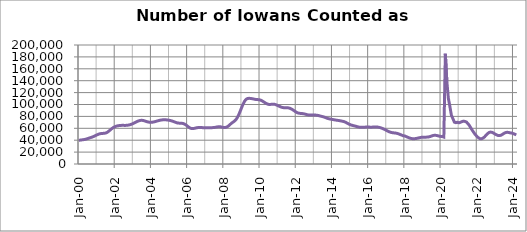
| Category | Series 0 |
|---|---|
| 2000-01-01 | 39830 |
| 2000-02-01 | 40147 |
| 2000-03-01 | 40514 |
| 2000-04-01 | 40882 |
| 2000-05-01 | 41314 |
| 2000-06-01 | 41949 |
| 2000-07-01 | 42786 |
| 2000-08-01 | 43704 |
| 2000-09-01 | 44538 |
| 2000-10-01 | 45369 |
| 2000-11-01 | 46421 |
| 2000-12-01 | 47638 |
| 2001-01-01 | 48876 |
| 2001-02-01 | 50011 |
| 2001-03-01 | 50833 |
| 2001-04-01 | 51273 |
| 2001-05-01 | 51437 |
| 2001-06-01 | 51614 |
| 2001-07-01 | 52204 |
| 2001-08-01 | 53465 |
| 2001-09-01 | 55340 |
| 2001-10-01 | 57507 |
| 2001-11-01 | 59630 |
| 2001-12-01 | 61447 |
| 2002-01-01 | 62791 |
| 2002-02-01 | 63691 |
| 2002-03-01 | 64287 |
| 2002-04-01 | 64669 |
| 2002-05-01 | 64891 |
| 2002-06-01 | 64965 |
| 2002-07-01 | 64915 |
| 2002-08-01 | 64891 |
| 2002-09-01 | 65052 |
| 2002-10-01 | 65429 |
| 2002-11-01 | 66023 |
| 2002-12-01 | 66863 |
| 2003-01-01 | 67993 |
| 2003-02-01 | 69300 |
| 2003-03-01 | 70620 |
| 2003-04-01 | 71806 |
| 2003-05-01 | 72744 |
| 2003-06-01 | 73309 |
| 2003-07-01 | 73369 |
| 2003-08-01 | 72946 |
| 2003-09-01 | 72139 |
| 2003-10-01 | 71272 |
| 2003-11-01 | 70583 |
| 2003-12-01 | 70165 |
| 2004-01-01 | 70093 |
| 2004-02-01 | 70340 |
| 2004-03-01 | 70866 |
| 2004-04-01 | 71551 |
| 2004-05-01 | 72278 |
| 2004-06-01 | 72994 |
| 2004-07-01 | 73630 |
| 2004-08-01 | 74060 |
| 2004-09-01 | 74268 |
| 2004-10-01 | 74325 |
| 2004-11-01 | 74177 |
| 2004-12-01 | 73909 |
| 2005-01-01 | 73474 |
| 2005-02-01 | 72885 |
| 2005-03-01 | 72129 |
| 2005-04-01 | 71211 |
| 2005-05-01 | 70200 |
| 2005-06-01 | 69259 |
| 2005-07-01 | 68744 |
| 2005-08-01 | 68630 |
| 2005-09-01 | 68578 |
| 2005-10-01 | 68176 |
| 2005-11-01 | 67243 |
| 2005-12-01 | 65744 |
| 2006-01-01 | 63789 |
| 2006-02-01 | 61778 |
| 2006-03-01 | 60216 |
| 2006-04-01 | 59491 |
| 2006-05-01 | 59563 |
| 2006-06-01 | 60147 |
| 2006-07-01 | 60766 |
| 2006-08-01 | 61189 |
| 2006-09-01 | 61436 |
| 2006-10-01 | 61375 |
| 2006-11-01 | 61120 |
| 2006-12-01 | 60856 |
| 2007-01-01 | 60796 |
| 2007-02-01 | 60930 |
| 2007-03-01 | 61043 |
| 2007-04-01 | 61052 |
| 2007-05-01 | 61070 |
| 2007-06-01 | 61166 |
| 2007-07-01 | 61441 |
| 2007-08-01 | 61931 |
| 2007-09-01 | 62403 |
| 2007-10-01 | 62627 |
| 2007-11-01 | 62449 |
| 2007-12-01 | 61907 |
| 2008-01-01 | 61354 |
| 2008-02-01 | 61225 |
| 2008-03-01 | 61926 |
| 2008-04-01 | 63517 |
| 2008-05-01 | 65680 |
| 2008-06-01 | 67978 |
| 2008-07-01 | 69953 |
| 2008-08-01 | 71714 |
| 2008-09-01 | 73963 |
| 2008-10-01 | 77479 |
| 2008-11-01 | 82475 |
| 2008-12-01 | 88556 |
| 2009-01-01 | 95033 |
| 2009-02-01 | 101068 |
| 2009-03-01 | 105865 |
| 2009-04-01 | 108847 |
| 2009-05-01 | 110152 |
| 2009-06-01 | 110374 |
| 2009-07-01 | 110130 |
| 2009-08-01 | 109719 |
| 2009-09-01 | 109178 |
| 2009-10-01 | 108654 |
| 2009-11-01 | 108303 |
| 2009-12-01 | 108148 |
| 2010-01-01 | 107766 |
| 2010-02-01 | 106830 |
| 2010-03-01 | 105361 |
| 2010-04-01 | 103721 |
| 2010-05-01 | 102142 |
| 2010-06-01 | 100842 |
| 2010-07-01 | 100168 |
| 2010-08-01 | 100123 |
| 2010-09-01 | 100423 |
| 2010-10-01 | 100573 |
| 2010-11-01 | 100225 |
| 2010-12-01 | 99308 |
| 2011-01-01 | 98136 |
| 2011-02-01 | 96946 |
| 2011-03-01 | 95833 |
| 2011-04-01 | 95011 |
| 2011-05-01 | 94638 |
| 2011-06-01 | 94578 |
| 2011-07-01 | 94559 |
| 2011-08-01 | 94300 |
| 2011-09-01 | 93606 |
| 2011-10-01 | 92454 |
| 2011-11-01 | 90901 |
| 2011-12-01 | 89145 |
| 2012-01-01 | 87414 |
| 2012-02-01 | 86047 |
| 2012-03-01 | 85325 |
| 2012-04-01 | 85003 |
| 2012-05-01 | 84785 |
| 2012-06-01 | 84470 |
| 2012-07-01 | 83856 |
| 2012-08-01 | 83126 |
| 2012-09-01 | 82596 |
| 2012-10-01 | 82254 |
| 2012-11-01 | 82147 |
| 2012-12-01 | 82190 |
| 2013-01-01 | 82261 |
| 2013-02-01 | 82221 |
| 2013-03-01 | 81902 |
| 2013-04-01 | 81347 |
| 2013-05-01 | 80684 |
| 2013-06-01 | 80023 |
| 2013-07-01 | 79385 |
| 2013-08-01 | 78573 |
| 2013-09-01 | 77510 |
| 2013-10-01 | 76572 |
| 2013-11-01 | 75894 |
| 2013-12-01 | 75406 |
| 2014-01-01 | 74970 |
| 2014-02-01 | 74463 |
| 2014-03-01 | 73979 |
| 2014-04-01 | 73583 |
| 2014-05-01 | 73194 |
| 2014-06-01 | 72759 |
| 2014-07-01 | 72272 |
| 2014-08-01 | 71753 |
| 2014-09-01 | 71064 |
| 2014-10-01 | 69998 |
| 2014-11-01 | 68577 |
| 2014-12-01 | 67159 |
| 2015-01-01 | 65998 |
| 2015-02-01 | 65189 |
| 2015-03-01 | 64544 |
| 2015-04-01 | 63879 |
| 2015-05-01 | 63156 |
| 2015-06-01 | 62438 |
| 2015-07-01 | 61892 |
| 2015-08-01 | 61594 |
| 2015-09-01 | 61550 |
| 2015-10-01 | 61718 |
| 2015-11-01 | 61985 |
| 2015-12-01 | 62133 |
| 2016-01-01 | 62078 |
| 2016-02-01 | 61964 |
| 2016-03-01 | 61917 |
| 2016-04-01 | 62010 |
| 2016-05-01 | 62206 |
| 2016-06-01 | 62320 |
| 2016-07-01 | 62132 |
| 2016-08-01 | 61632 |
| 2016-09-01 | 60956 |
| 2016-10-01 | 60079 |
| 2016-11-01 | 59003 |
| 2016-12-01 | 57827 |
| 2017-01-01 | 56329 |
| 2017-02-01 | 55037 |
| 2017-03-01 | 53922 |
| 2017-04-01 | 53130 |
| 2017-05-01 | 52606 |
| 2017-06-01 | 52266 |
| 2017-07-01 | 51976 |
| 2017-08-01 | 51468 |
| 2017-09-01 | 50674 |
| 2017-10-01 | 49676 |
| 2017-11-01 | 48612 |
| 2017-12-01 | 47468 |
| 2018-01-01 | 47198 |
| 2018-02-01 | 46122 |
| 2018-03-01 | 45041 |
| 2018-04-01 | 43974 |
| 2018-05-01 | 43141 |
| 2018-06-01 | 42643 |
| 2018-07-01 | 42452 |
| 2018-08-01 | 42657 |
| 2018-09-01 | 43106 |
| 2018-10-01 | 43687 |
| 2018-11-01 | 44289 |
| 2018-12-01 | 44747 |
| 2019-01-01 | 45052 |
| 2019-02-01 | 45093 |
| 2019-03-01 | 45105 |
| 2019-04-01 | 45229 |
| 2019-05-01 | 45562 |
| 2019-06-01 | 46208 |
| 2019-07-01 | 47130 |
| 2019-08-01 | 47999 |
| 2019-09-01 | 48319 |
| 2019-10-01 | 48066 |
| 2019-11-01 | 47448 |
| 2019-12-01 | 46809 |
| 2020-01-01 | 46392 |
| 2020-02-01 | 46048 |
| 2020-03-01 | 45198 |
| 2020-04-01 | 185220 |
| 2020-05-01 | 138978 |
| 2020-06-01 | 110330 |
| 2020-07-01 | 97026 |
| 2020-08-01 | 82029 |
| 2020-09-01 | 76250 |
| 2020-10-01 | 70260 |
| 2020-11-01 | 69462 |
| 2020-12-01 | 70181 |
| 2021-01-01 | 69273 |
| 2021-02-01 | 70096 |
| 2021-03-01 | 71187 |
| 2021-04-01 | 72047 |
| 2021-05-01 | 71509 |
| 2021-06-01 | 70486 |
| 2021-07-01 | 67845 |
| 2021-08-01 | 64412 |
| 2021-09-01 | 60192 |
| 2021-10-01 | 56187 |
| 2021-11-01 | 52322 |
| 2021-12-01 | 49047 |
| 2022-01-01 | 46275 |
| 2022-02-01 | 43935 |
| 2022-03-01 | 42559 |
| 2022-04-01 | 42404 |
| 2022-05-22 | 43531 |
| 2022-06-22 | 45617 |
| 2022-07-22 | 48380 |
| 2022-08-22 | 51099 |
| 2022-09-22 | 52957 |
| 2022-10-22 | 53694 |
| 2022-11-22 | 53172 |
| 2022-12-01 | 51822 |
| 2023-01-01 | 50246 |
| 2023-02-01 | 48862 |
| 2023-03-01 | 47914 |
| 2023-04-01 | 47712 |
| 2023-05-01 | 48508 |
| 2023-06-01 | 50056 |
| 2023-07-01 | 51694 |
| 2023-08-01 | 52866 |
| 2023-09-01 | 53301 |
| 2023-10-01 | 52994 |
| 2023-11-01 | 52321 |
| 2023-12-01 | 52035 |
| 2024-01-01 | 51077 |
| 2024-02-01 | 50182 |
| 2024-03-01 | 48724 |